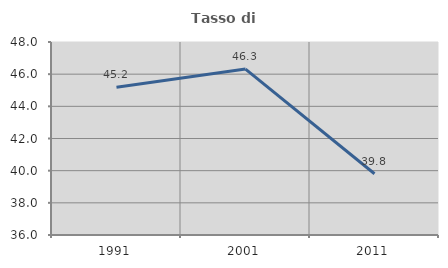
| Category | Tasso di occupazione   |
|---|---|
| 1991.0 | 45.192 |
| 2001.0 | 46.316 |
| 2011.0 | 39.806 |